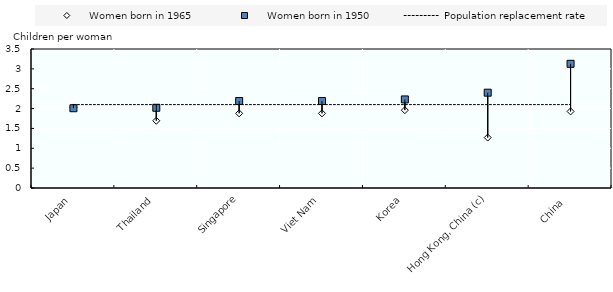
| Category | Women born in 1965 | Women born in 1950 | Population replacement rate |
|---|---|---|---|
| Japan | 2.028 | 2.009 | 2.1 |
| Thailand | 1.693 | 2.02 | 2.1 |
| Singapore | 1.88 | 2.19 | 2.1 |
| Viet Nam | 1.88 | 2.19 | 2.1 |
| Korea | 1.96 | 2.23 | 2.1 |
| Hong Kong, China (c) | 1.27 | 2.4 | 2.1 |
| China  | 1.928 | 3.127 | 2.1 |